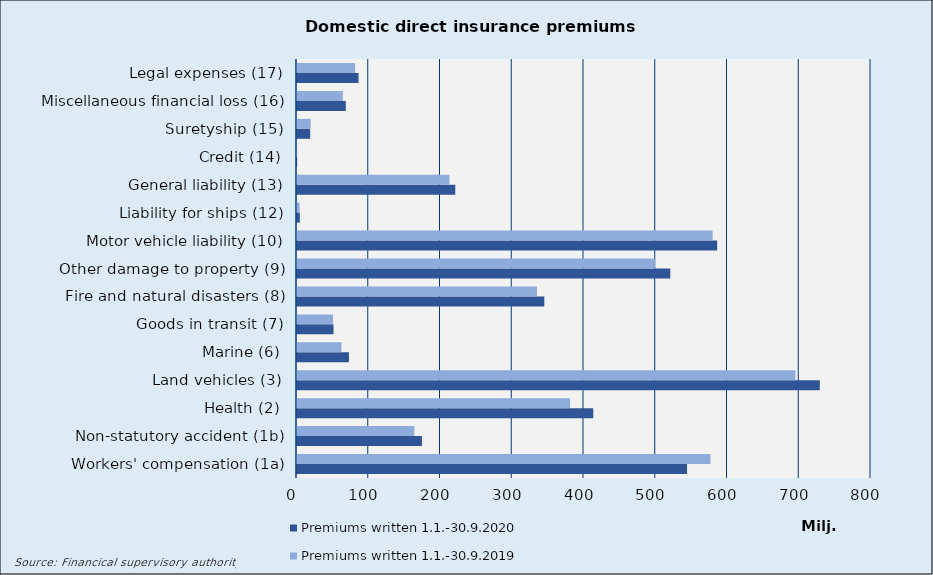
| Category | Premiums written |
|---|---|
| Workers' compensation (1a) | 576249.102 |
| Non-statutory accident (1b) | 163446.357 |
| Health (2) | 380622.838 |
| Land vehicles (3) | 694660.311 |
| Marine (6) | 62080.025 |
| Goods in transit (7) | 50230.381 |
| Fire and natural disasters (8) | 334492.517 |
| Other damage to property (9) | 498850.509 |
| Motor vehicle liability (10) | 579236.279 |
| Liability for ships (12) | 3630.547 |
| General liability (13) | 212482.377 |
| Credit (14) | 215.222 |
| Suretyship (15) | 19164.495 |
| Miscellaneous financial loss (16) | 63863.262 |
| Legal expenses (17) | 81109.614 |